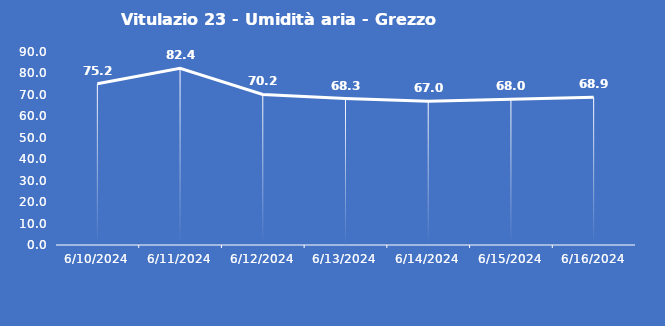
| Category | Vitulazio 23 - Umidità aria - Grezzo (%) |
|---|---|
| 6/10/24 | 75.2 |
| 6/11/24 | 82.4 |
| 6/12/24 | 70.2 |
| 6/13/24 | 68.3 |
| 6/14/24 | 67 |
| 6/15/24 | 68 |
| 6/16/24 | 68.9 |